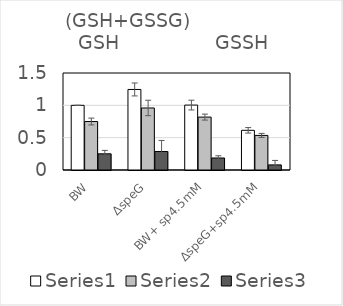
| Category | Series 1 | Series 4 | Series 7 |
|---|---|---|---|
| BW | 1 | 0.75 | 0.25 |
| ΔspeG | 1.245 | 0.959 | 0.286 |
| BW+ sp4.5mM | 1.004 | 0.818 | 0.186 |
| ΔspeG+sp4.5mM | 0.614 | 0.535 | 0.079 |